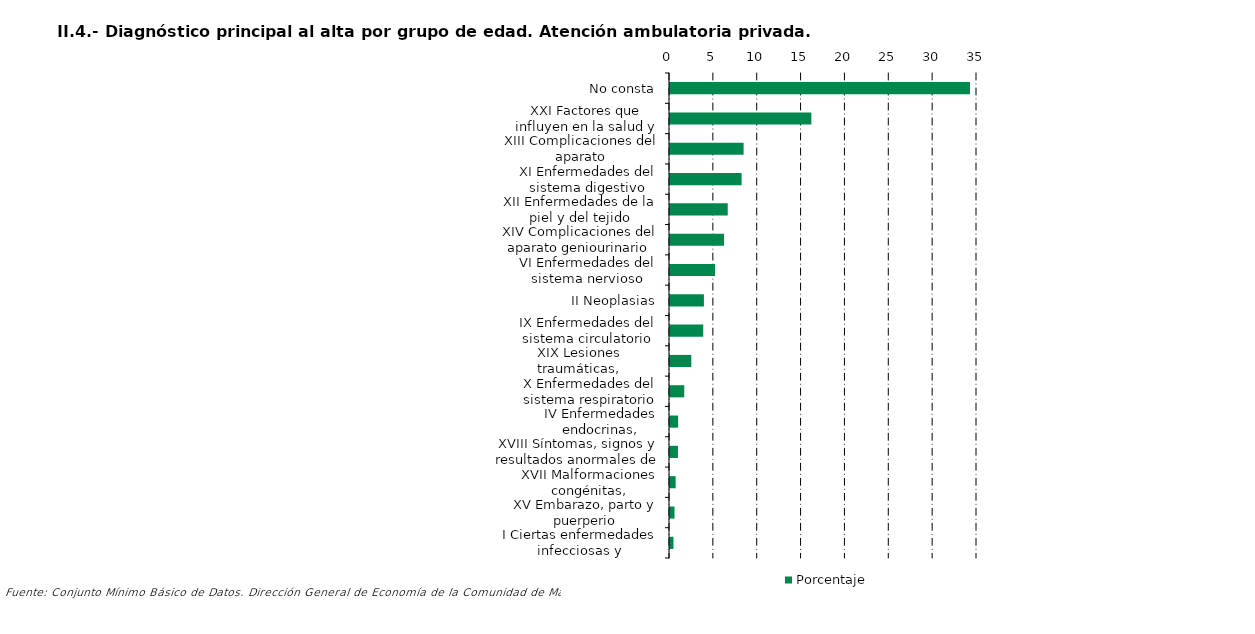
| Category | Porcentaje |
|---|---|
| No consta | 34.2 |
| XXI Factores que influyen en la salud y contacto con los servicios sanitarios | 16.115 |
| XIII Complicaciones del aparato musculoesquelético y del tejido conectivo | 8.392 |
| XI Enfermedades del sistema digestivo | 8.165 |
| XII Enfermedades de la piel y del tejido subcutáneo | 6.582 |
| XIV Complicaciones del aparato geniourinario | 6.164 |
| VI Enfermedades del sistema nervioso | 5.137 |
| II Neoplasias | 3.867 |
| IX Enfermedades del sistema circulatorio | 3.79 |
| XIX Lesiones traumáticas, envenenamientos y otras consecuencias de causas externas | 2.429 |
| X Enfermedades del sistema respiratorio | 1.624 |
| IV Enfermedades endocrinas, nutricionales y metabólicas | 0.925 |
| XVIII Síntomas, signos y resultados anormales de pruebas complementarias, no clasificados bajo otro concepto | 0.906 |
| XVII Malformaciones congénitas, deformidades y anomalías cromosómicas | 0.643 |
| XV Embarazo, parto y puerperio | 0.511 |
| I Ciertas enfermedades infecciosas y parasitarias | 0.397 |